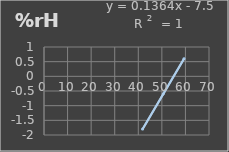
| Category | Humedad |
|---|---|
| 41.8 | -1.8 |
| 50.6 | -0.6 |
| 59.4 | 0.6 |